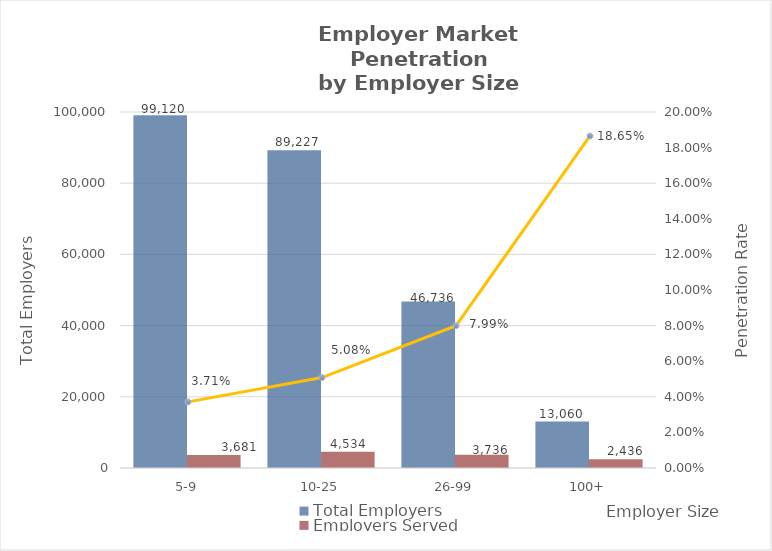
| Category | Total Employers | Employers Served |
|---|---|---|
| 5-9 | 99120 | 3681 |
| 10-25 | 89227 | 4534 |
| 26-99 | 46736 | 3736 |
| 100+ | 13060 | 2436 |